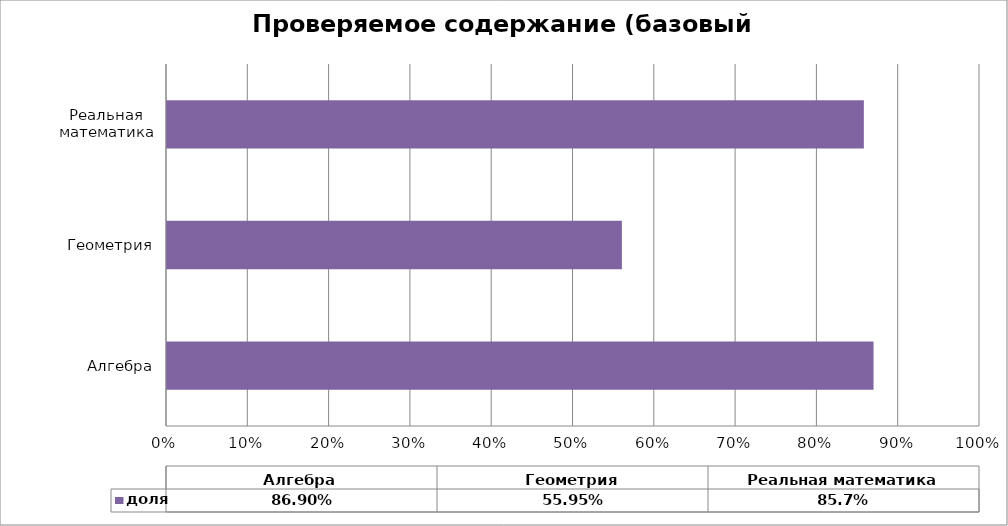
| Category | доля |
|---|---|
| Алгебра | 0.869 |
| Геометрия | 0.56 |
| Реальная математика | 0.857 |